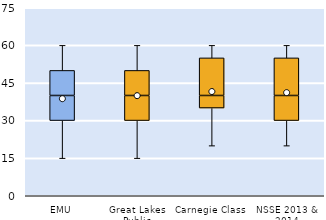
| Category | 25th | 50th | 75th |
|---|---|---|---|
| EMU | 30 | 10 | 10 |
| Great Lakes Public | 30 | 10 | 10 |
| Carnegie Class | 35 | 5 | 15 |
| NSSE 2013 & 2014 | 30 | 10 | 15 |